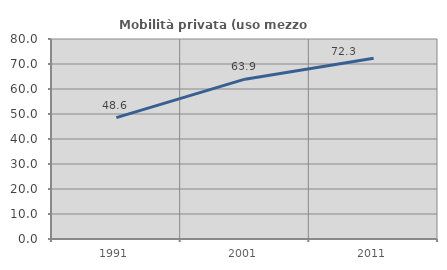
| Category | Mobilità privata (uso mezzo privato) |
|---|---|
| 1991.0 | 48.568 |
| 2001.0 | 63.94 |
| 2011.0 | 72.264 |